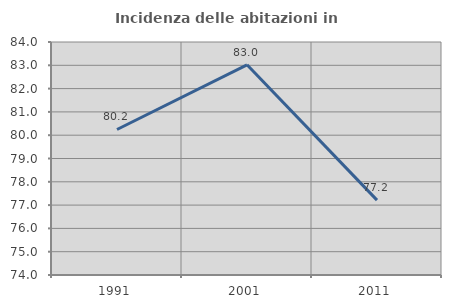
| Category | Incidenza delle abitazioni in proprietà  |
|---|---|
| 1991.0 | 80.246 |
| 2001.0 | 83.02 |
| 2011.0 | 77.212 |